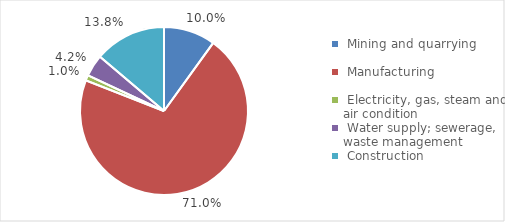
| Category | Enterprises  |
|---|---|
|  Mining and quarrying  | 86.6 |
|  Manufacturing  | 617.6 |
|  Electricity, gas, steam and air condition  | 9 |
|  Water supply; sewerage, waste management  | 36.6 |
|  Construction  | 120.1 |